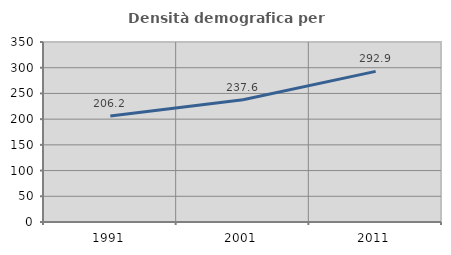
| Category | Densità demografica |
|---|---|
| 1991.0 | 206.164 |
| 2001.0 | 237.588 |
| 2011.0 | 292.891 |